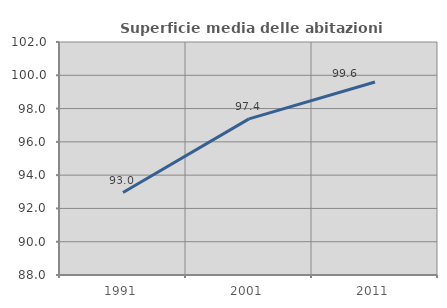
| Category | Superficie media delle abitazioni occupate |
|---|---|
| 1991.0 | 92.956 |
| 2001.0 | 97.382 |
| 2011.0 | 99.597 |